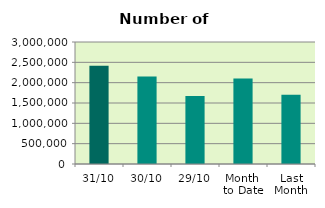
| Category | Series 0 |
|---|---|
| 31/10 | 2414132 |
| 30/10 | 2153046 |
| 29/10 | 1671490 |
| Month 
to Date | 2101052.87 |
| Last
Month | 1700207.9 |